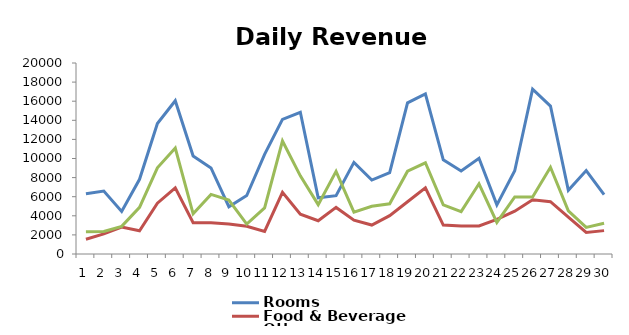
| Category | Rooms | Food & Beverage | Other |
|---|---|---|---|
| 0 | 6300 | 1549.8 | 2324.7 |
| 1 | 6588 | 2110.68 | 2368.08 |
| 2 | 4457 | 2826.8 | 2897.47 |
| 3 | 7820 | 2439.84 | 4879.68 |
| 4 | 13668 | 5318.28 | 9024.96 |
| 5 | 16046 | 6929.6 | 11087.36 |
| 6 | 10264 | 3269.28 | 4203.36 |
| 7 | 9010 | 3273.28 | 6239.69 |
| 8 | 4949 | 3148.74 | 5649.21 |
| 9 | 6120 | 2907 | 3136.5 |
| 10 | 10441 | 2356.38 | 4833.6 |
| 11 | 14091 | 6454.56 | 11833.36 |
| 12 | 14840 | 4160.7 | 8182.71 |
| 13 | 5883 | 3480.51 | 5168.03 |
| 14 | 6104 | 4878.72 | 8648.64 |
| 15 | 9593 | 3549.94 | 4385.22 |
| 16 | 7740 | 3034.08 | 4993.59 |
| 17 | 8526 | 4013.1 | 5255.25 |
| 18 | 15833 | 5475.6 | 8669.7 |
| 19 | 16768 | 6933.15 | 9552.34 |
| 20 | 9856 | 3026.8 | 5152 |
| 21 | 8690 | 2932.6 | 4433 |
| 22 | 10026 | 2940 | 7350 |
| 23 | 5145 | 3615.71 | 3307.99 |
| 24 | 8721 | 4479.84 | 5973.12 |
| 25 | 17253 | 5680 | 5964 |
| 26 | 15493 | 5476.94 | 9080.19 |
| 27 | 6669 | 3870.72 | 4515.84 |
| 28 | 8740 | 2260.44 | 2782.08 |
| 29 | 6222 | 2448 | 3213 |